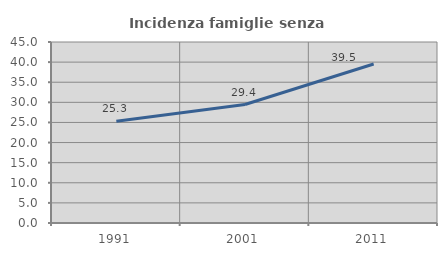
| Category | Incidenza famiglie senza nuclei |
|---|---|
| 1991.0 | 25.305 |
| 2001.0 | 29.449 |
| 2011.0 | 39.524 |